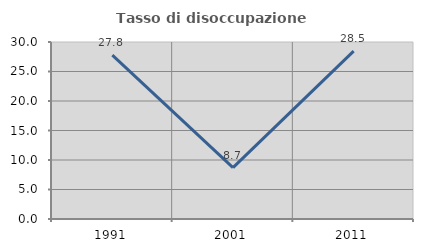
| Category | Tasso di disoccupazione giovanile  |
|---|---|
| 1991.0 | 27.778 |
| 2001.0 | 8.696 |
| 2011.0 | 28.462 |